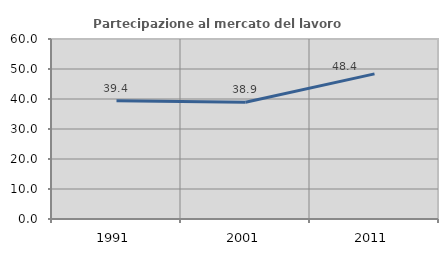
| Category | Partecipazione al mercato del lavoro  femminile |
|---|---|
| 1991.0 | 39.376 |
| 2001.0 | 38.919 |
| 2011.0 | 48.375 |